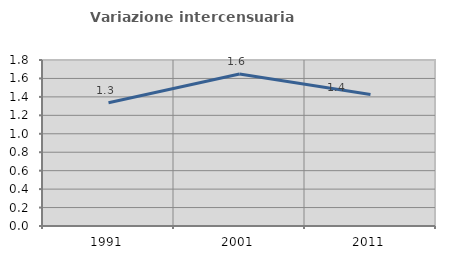
| Category | Variazione intercensuaria annua |
|---|---|
| 1991.0 | 1.337 |
| 2001.0 | 1.647 |
| 2011.0 | 1.427 |